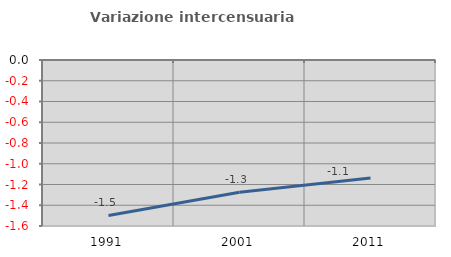
| Category | Variazione intercensuaria annua |
|---|---|
| 1991.0 | -1.499 |
| 2001.0 | -1.276 |
| 2011.0 | -1.138 |